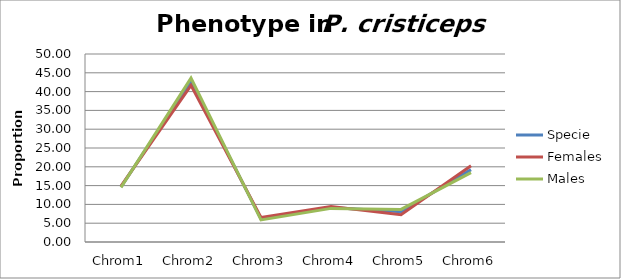
| Category | Specie | Females | Males |
|---|---|---|---|
| Chrom1 | 14.669 | 14.855 | 14.525 |
| Chrom2 | 42.744 | 41.667 | 43.575 |
| Chrom3 | 6.151 | 6.522 | 5.866 |
| Chrom4 | 9.148 | 9.42 | 8.939 |
| Chrom5 | 8.044 | 7.246 | 8.659 |
| Chrom6 | 19.243 | 20.29 | 18.436 |